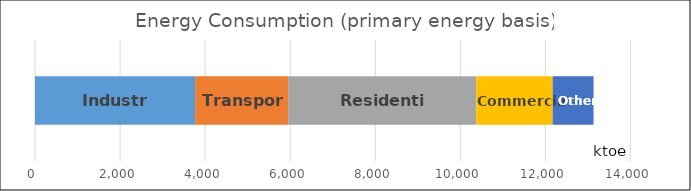
| Category | Industry | Transport | Residential | Commercial | Others |
|---|---|---|---|---|---|
| 0 | 3764.984 | 2186.199 | 4423.57 | 1795.048 | 962.199 |